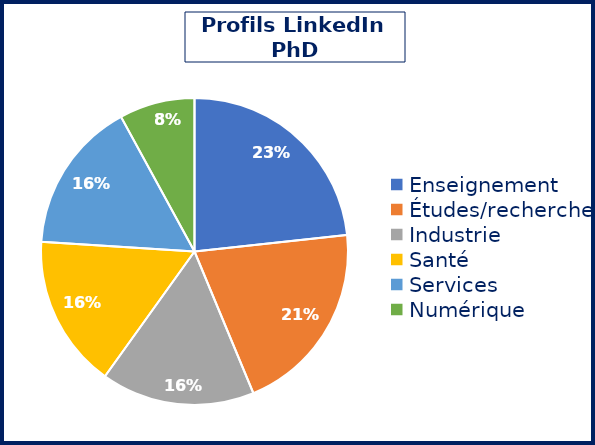
| Category | Series 0 |
|---|---|
| Enseignement | 691 |
| Études/recherche | 607 |
| Industrie | 480 |
| Santé | 478 |
| Services | 476 |
| Numérique | 236 |